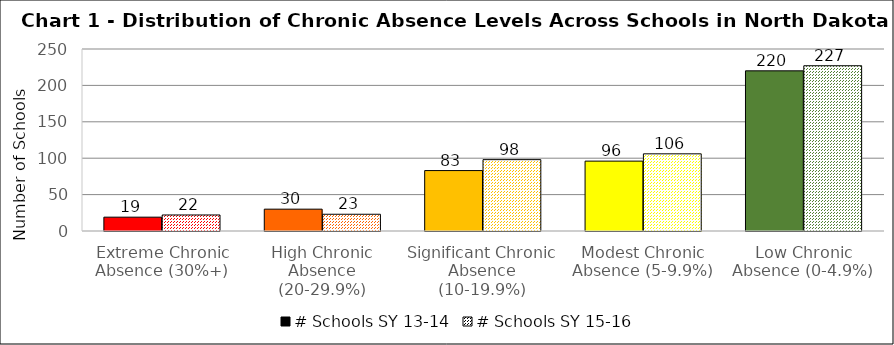
| Category | # Schools SY 13-14 | # Schools SY 15-16 |
|---|---|---|
| Extreme Chronic Absence (30%+) | 19 | 22 |
| High Chronic Absence (20-29.9%) | 30 | 23 |
| Significant Chronic Absence (10-19.9%) | 83 | 98 |
| Modest Chronic Absence (5-9.9%) | 96 | 106 |
| Low Chronic Absence (0-4.9%) | 220 | 227 |